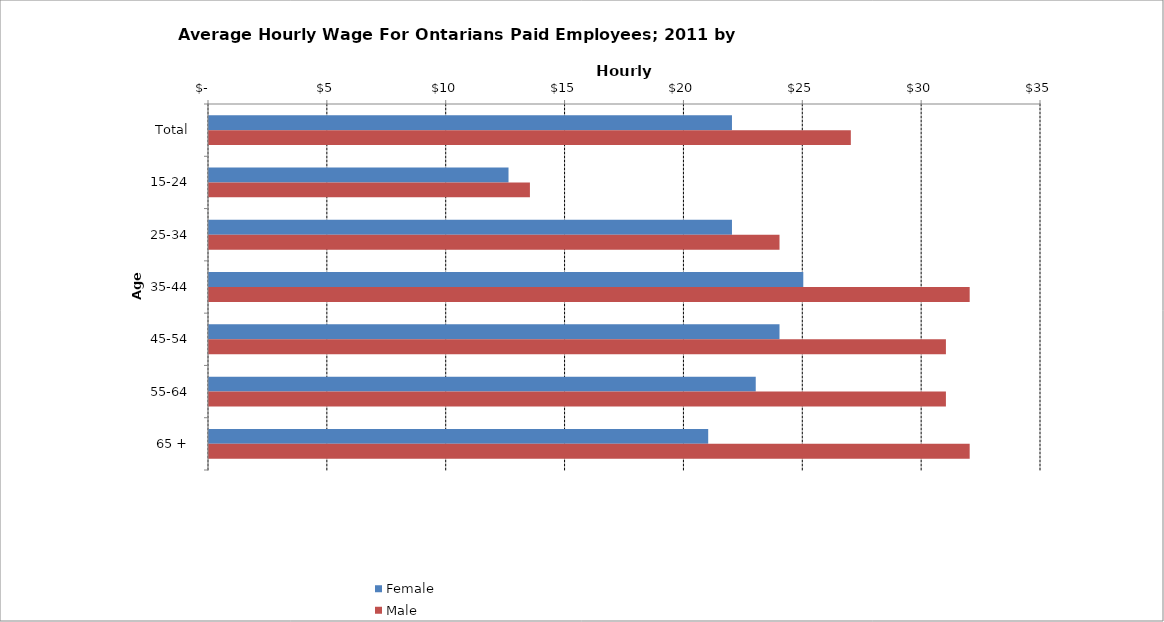
| Category | Female | Male |
|---|---|---|
| Total | 22 | 27 |
|  15-24  | 12.6 | 13.5 |
|  25-34  | 22 | 24 |
|  35-44  | 25 | 32 |
|  45-54  | 24 | 31 |
|  55-64  | 23 | 31 |
|  65 +  | 21 | 32 |